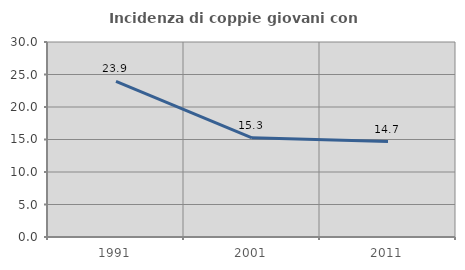
| Category | Incidenza di coppie giovani con figli |
|---|---|
| 1991.0 | 23.942 |
| 2001.0 | 15.254 |
| 2011.0 | 14.677 |